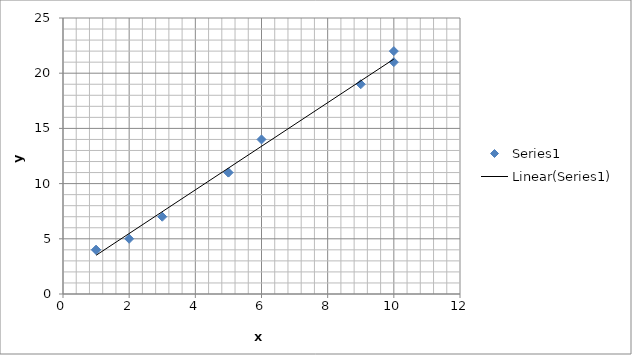
| Category | Series 0 |
|---|---|
| 5.0 | 11 |
| 1.0 | 4 |
| 3.0 | 7 |
| 10.0 | 21 |
| 2.0 | 5 |
| 9.0 | 19 |
| 6.0 | 14 |
| 10.0 | 22 |
| 1.0 | 4 |
| 5.0 | 11 |